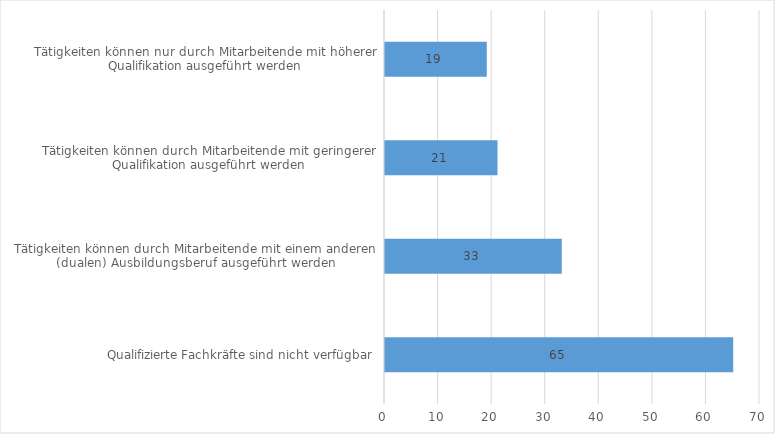
| Category | Series 0 |
|---|---|
| Qualifizierte Fachkräfte sind nicht verfügbar | 65 |
| Tätigkeiten können durch Mitarbeitende mit einem anderen (dualen) Ausbildungsberuf ausgeführt werden | 33 |
| Tätigkeiten können durch Mitarbeitende mit geringerer Qualifikation ausgeführt werden | 21 |
| Tätigkeiten können nur durch Mitarbeitende mit höherer Qualifikation ausgeführt werden | 19 |